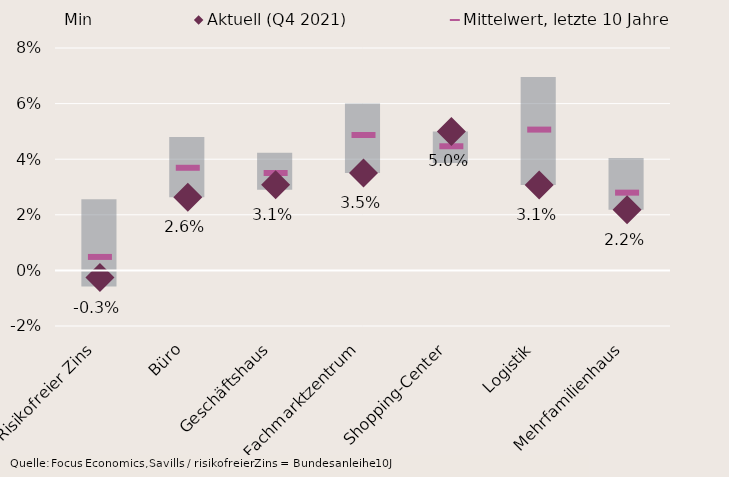
| Category | Min | Spanne Min/Max, letzte 10 Jahre |
|---|---|---|
| Risikofreier Zins | -0.006 | 0.026 |
| Büro | 0.026 | 0.022 |
| Geschäftshaus | 0.029 | 0.013 |
| Fachmarktzentrum | 0.035 | 0.025 |
| Shopping-Center | 0.039 | 0.011 |
| Logistik | 0.031 | 0.039 |
| Mehrfamilienhaus | 0.022 | 0.019 |